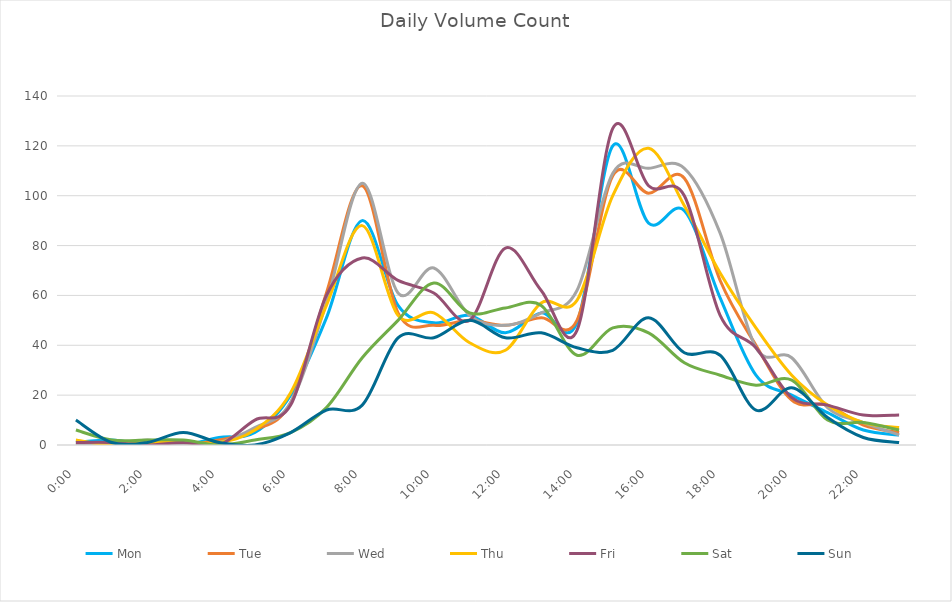
| Category | Mon | Tue | Wed | Thu | Fri | Sat | Sun |
|---|---|---|---|---|---|---|---|
| 0.0 | 1 | 0 | 0 | 2 | 1 | 6 | 10 |
| 0.0416666666666667 | 2 | 0 | 0 | 0 | 1 | 2 | 1 |
| 0.0833333333333333 | 0 | 0 | 2 | 1 | 0 | 2 | 1 |
| 0.125 | 0 | 0 | 0 | 1 | 1 | 2 | 5 |
| 0.166666666666667 | 3 | 2 | 1 | 1 | 0 | 0 | 1 |
| 0.208333333333333 | 5 | 6 | 7 | 6 | 10 | 2 | 0 |
| 0.25 | 20 | 17 | 17 | 21 | 16 | 5 | 5 |
| 0.291666666666667 | 51 | 61 | 57 | 56 | 60 | 15 | 14 |
| 0.333333333333333 | 90 | 104 | 105 | 88 | 75 | 35 | 16 |
| 0.375 | 56 | 53 | 61 | 52 | 66 | 50 | 43 |
| 0.416666666666667 | 49 | 48 | 71 | 53 | 61 | 65 | 43 |
| 0.4583333333333333 | 52 | 50 | 52 | 41 | 50 | 53 | 50 |
| 0.5 | 45 | 48 | 48 | 38 | 79 | 55 | 43 |
| 0.541666666666667 | 53 | 51 | 53 | 57 | 62 | 56 | 45 |
| 0.5833333333333334 | 49 | 50 | 62 | 58 | 46 | 36 | 39 |
| 0.625 | 120 | 108 | 109 | 100 | 127 | 47 | 38 |
| 0.666666666666667 | 89 | 101 | 111 | 119 | 104 | 45 | 51 |
| 0.7083333333333334 | 94 | 107 | 111 | 96 | 100 | 33 | 37 |
| 0.75 | 59 | 66 | 85 | 69 | 52 | 28 | 36 |
| 0.791666666666667 | 28 | 40 | 39 | 47 | 39 | 24 | 14 |
| 0.8333333333333334 | 20 | 18 | 35 | 28 | 19 | 26 | 23 |
| 0.875 | 13 | 16 | 15 | 16 | 16 | 10 | 11 |
| 0.916666666666667 | 6 | 8 | 9 | 9 | 12 | 9 | 3 |
| 0.9583333333333334 | 4 | 5 | 4 | 7 | 12 | 6 | 1 |